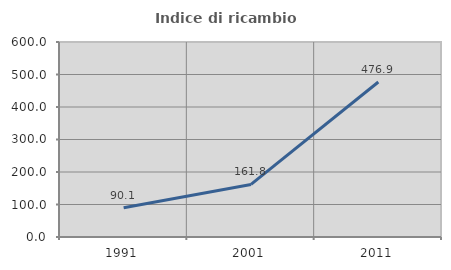
| Category | Indice di ricambio occupazionale  |
|---|---|
| 1991.0 | 90.052 |
| 2001.0 | 161.789 |
| 2011.0 | 476.923 |